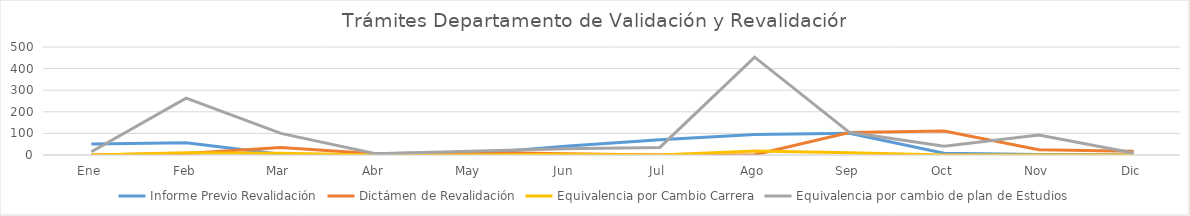
| Category | Informe Previo Revalidación | Dictámen de Revalidación | Equivalencia por Cambio Carrera | Equivalencia por cambio de plan de Estudios |
|---|---|---|---|---|
| Ene | 51 | 0 | 0 | 15 |
| Feb | 57 | 7 | 10 | 263 |
| Mar | 3 | 35 | 8 | 100 |
| Abr | 0 | 6 | 0 | 6 |
| May | 5 | 13 | 0 | 17 |
| Jun | 40 | 6 | 4 | 29 |
| Jul | 71 | 0 | 0 | 35 |
| Ago | 95 | 1 | 18 | 453 |
| Sep | 101 | 104 | 10 | 105 |
| Oct | 8 | 111 | 0 | 41 |
| Nov | 2 | 24 | 0 | 93 |
| Dic | 1 | 17 | 0 | 9 |